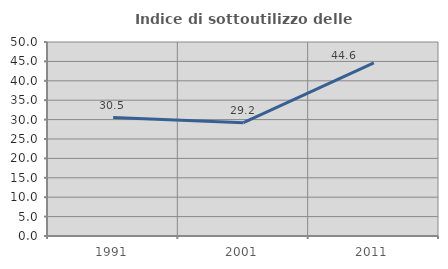
| Category | Indice di sottoutilizzo delle abitazioni  |
|---|---|
| 1991.0 | 30.541 |
| 2001.0 | 29.197 |
| 2011.0 | 44.595 |